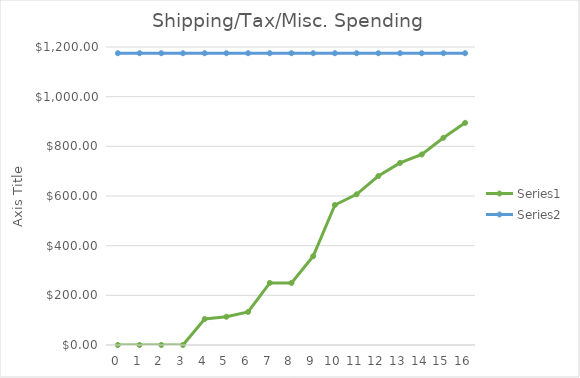
| Category | Series 0 | Series 1 |
|---|---|---|
| 0.0 | 0 | 1175 |
| 1.0 | 0 | 1175 |
| 2.0 | 0 | 1175 |
| 3.0 | 0 | 1175 |
| 4.0 | 104.7 | 1175 |
| 5.0 | 113.69 | 1175 |
| 6.0 | 133.18 | 1175 |
| 7.0 | 250.02 | 1175 |
| 8.0 | 250.02 | 1175 |
| 9.0 | 357.63 | 1175 |
| 10.0 | 563.8 | 1175 |
| 11.0 | 606.82 | 1175 |
| 12.0 | 680.33 | 1175 |
| 13.0 | 733.23 | 1175 |
| 14.0 | 767.17 | 1175 |
| 15.0 | 834.55 | 1175 |
| 16.0 | 894.55 | 1175 |